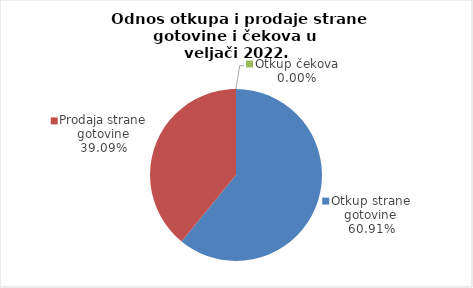
| Category | Series 0 |
|---|---|
| Otkup strane gotovine | 60.911 |
| Prodaja strane gotovine | 39.089 |
| Otkup čekova | 0 |